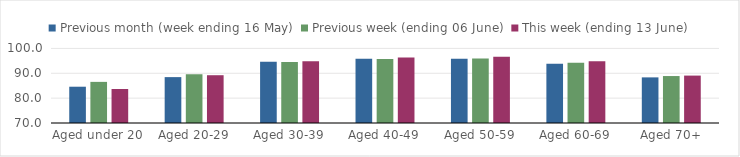
| Category | Previous month (week ending 16 May) | Previous week (ending 06 June) | This week (ending 13 June) |
|---|---|---|---|
| Aged under 20 | 84.597 | 86.543 | 83.677 |
| Aged 20-29 | 88.459 | 89.614 | 89.224 |
| Aged 30-39 | 94.605 | 94.578 | 94.857 |
| Aged 40-49 | 95.862 | 95.762 | 96.318 |
| Aged 50-59 | 95.852 | 95.972 | 96.664 |
| Aged 60-69 | 93.837 | 94.23 | 94.868 |
| Aged 70+ | 88.354 | 88.891 | 89.074 |